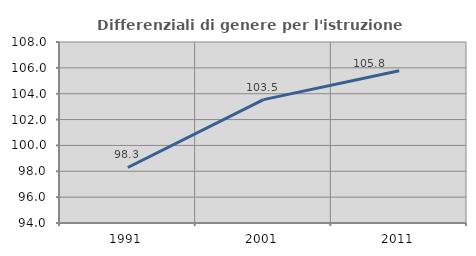
| Category | Differenziali di genere per l'istruzione superiore |
|---|---|
| 1991.0 | 98.295 |
| 2001.0 | 103.545 |
| 2011.0 | 105.775 |